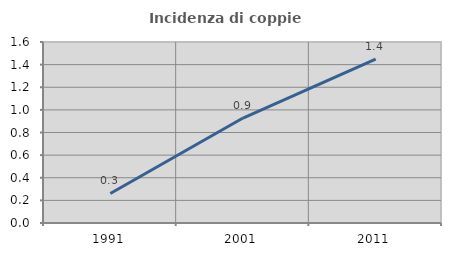
| Category | Incidenza di coppie miste |
|---|---|
| 1991.0 | 0.261 |
| 2001.0 | 0.928 |
| 2011.0 | 1.449 |